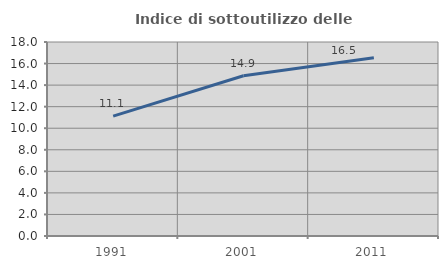
| Category | Indice di sottoutilizzo delle abitazioni  |
|---|---|
| 1991.0 | 11.123 |
| 2001.0 | 14.874 |
| 2011.0 | 16.546 |